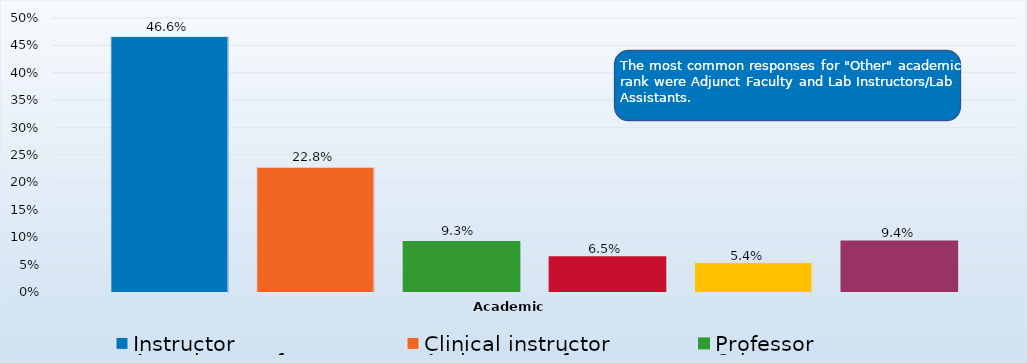
| Category | Instructor | Clinical instructor | Professor | Associate professor | Assistant professor | Other |
|---|---|---|---|---|---|---|
| 0 | 0.466 | 0.228 | 0.093 | 0.065 | 0.054 | 0.094 |